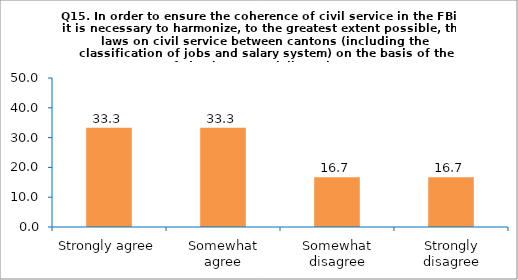
| Category | Series 0 |
|---|---|
| Strongly agree | 33.333 |
| Somewhat agree | 33.333 |
| Somewhat disagree | 16.667 |
| Strongly disagree | 16.667 |